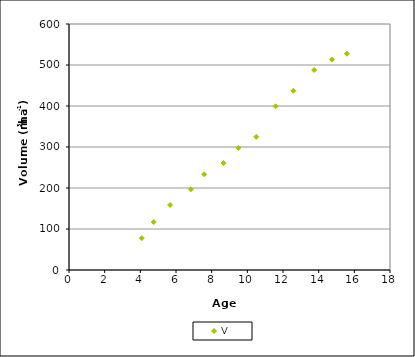
| Category | V |
|---|---|
| 4.083333333333333 | 77.72 |
| 4.75 | 117.06 |
| 5.666666666666667 | 158.49 |
| 6.833333333333333 | 196.73 |
| 7.583333333333333 | 233.37 |
| 8.666666666666666 | 260.81 |
| 9.5 | 297.91 |
| 10.5 | 324.82 |
| 11.583333333333334 | 399.26 |
| 12.583333333333334 | 437.25 |
| 13.75 | 487.86 |
| 14.75 | 513.3 |
| 15.583333333333334 | 527.64 |